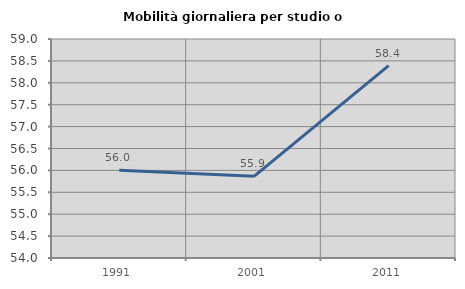
| Category | Mobilità giornaliera per studio o lavoro |
|---|---|
| 1991.0 | 56.004 |
| 2001.0 | 55.864 |
| 2011.0 | 58.393 |